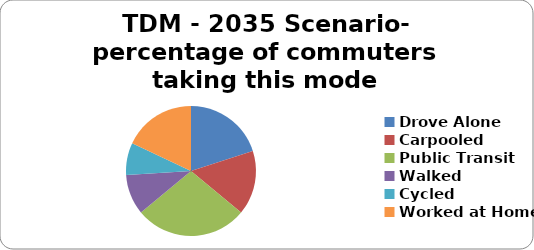
| Category | TDM - 2035 Scenario- percentage of commuters taking this mode |
|---|---|
| Drove Alone | 0.2 |
| Carpooled | 0.16 |
| Public Transit | 0.28 |
| Walked | 0.1 |
| Cycled | 0.08 |
| Worked at Home | 0.18 |